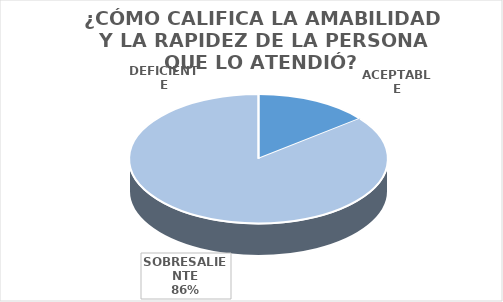
| Category | Series 0 |
|---|---|
| DEFICIENTE | 0 |
| ACEPTABLE | 30 |
| SOBRESALIENTE | 179 |